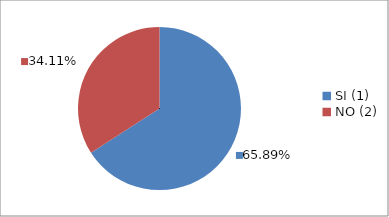
| Category | Series 0 |
|---|---|
| SI (1) | 0.659 |
| NO (2) | 0.341 |